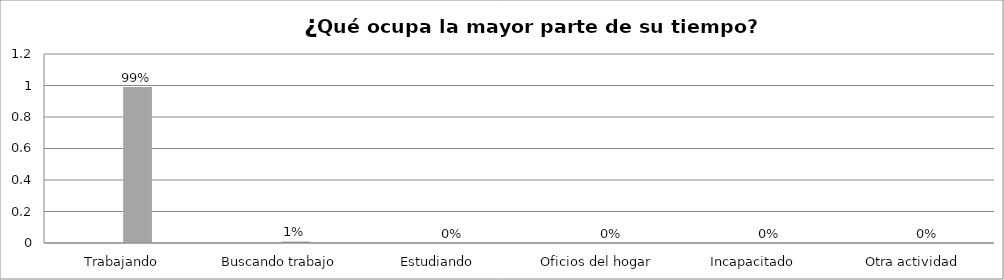
| Category | Series 0 | Series 1 | Series 2 | Series 3 |
|---|---|---|---|---|
| Trabajando |  |  | 0.99 |  |
| Buscando trabajo |  |  | 0.01 |  |
| Estudiando |  |  | 0 |  |
| Oficios del hogar |  |  | 0 |  |
| Incapacitado  |  |  | 0 |  |
| Otra actividad |  |  | 0 |  |